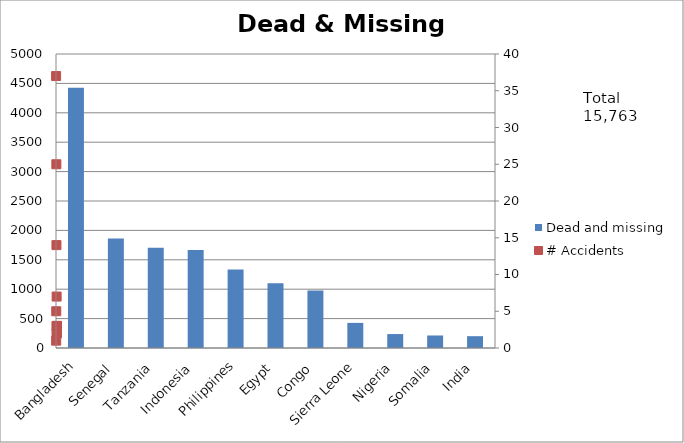
| Category | Dead and missing |
|---|---|
| Bangladesh | 4426 |
| Senegal | 1863 |
| Tanzania | 1704 |
| Indonesia | 1668 |
| Philippines | 1336 |
| Egypt | 1103 |
| Congo | 978 |
| Sierra Leone | 427 |
| Nigeria | 237 |
| Somalia | 213 |
| India | 201 |